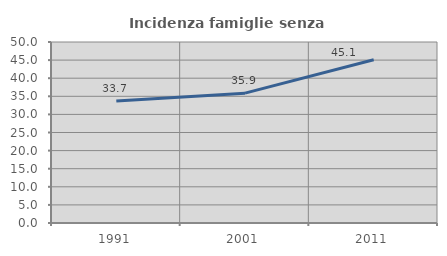
| Category | Incidenza famiglie senza nuclei |
|---|---|
| 1991.0 | 33.725 |
| 2001.0 | 35.868 |
| 2011.0 | 45.107 |